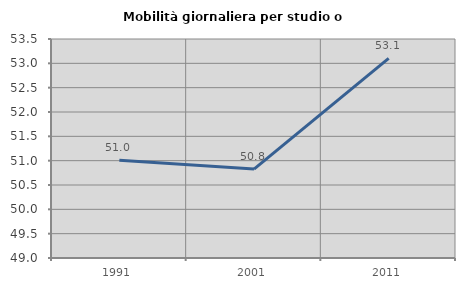
| Category | Mobilità giornaliera per studio o lavoro |
|---|---|
| 1991.0 | 51.007 |
| 2001.0 | 50.828 |
| 2011.0 | 53.103 |